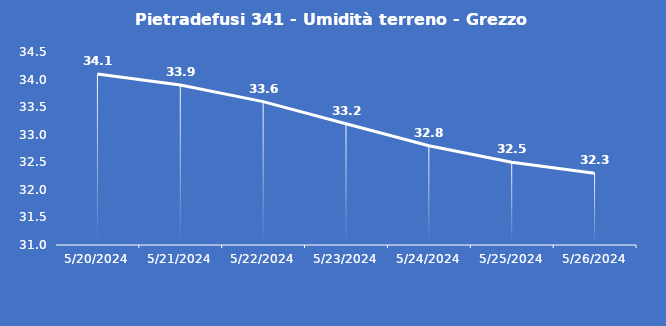
| Category | Pietradefusi 341 - Umidità terreno - Grezzo (%VWC) |
|---|---|
| 5/20/24 | 34.1 |
| 5/21/24 | 33.9 |
| 5/22/24 | 33.6 |
| 5/23/24 | 33.2 |
| 5/24/24 | 32.8 |
| 5/25/24 | 32.5 |
| 5/26/24 | 32.3 |